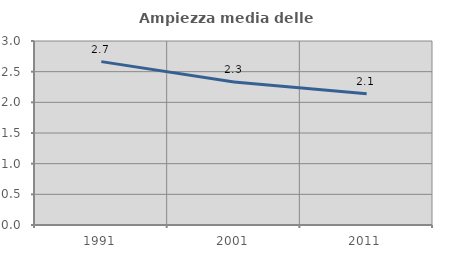
| Category | Ampiezza media delle famiglie |
|---|---|
| 1991.0 | 2.664 |
| 2001.0 | 2.333 |
| 2011.0 | 2.14 |